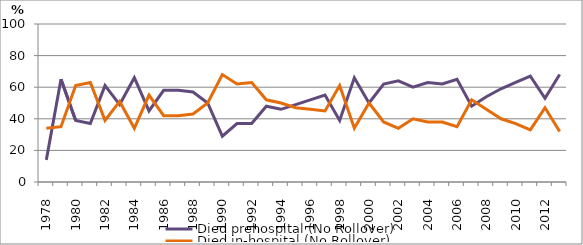
| Category | Died prehospital (No Rollover) | Died in-hospital (No Rollover) |
|---|---|---|
| 1978.0 | 14 | 34 |
| 1979.0 | 65 | 35 |
| 1980.0 | 39 | 61 |
| 1981.0 | 37 | 63 |
| 1982.0 | 61 | 39 |
| 1983.0 | 49 | 51 |
| 1984.0 | 66 | 34 |
| 1985.0 | 45 | 55 |
| 1986.0 | 58 | 42 |
| 1987.0 | 58 | 42 |
| 1988.0 | 57 | 43 |
| 1989.0 | 50 | 50 |
| 1990.0 | 29 | 68 |
| 1991.0 | 37 | 62 |
| 1992.0 | 37 | 63 |
| 1993.0 | 48 | 52 |
| 1994.0 | 46 | 50 |
| 1995.0 | 49 | 47 |
| 1996.0 | 52 | 46 |
| 1997.0 | 55 | 45 |
| 1998.0 | 39 | 61 |
| 1999.0 | 66 | 34 |
| 2000.0 | 50 | 50 |
| 2001.0 | 62 | 38 |
| 2002.0 | 64 | 34 |
| 2003.0 | 60 | 40 |
| 2004.0 | 63 | 38 |
| 2005.0 | 62 | 38 |
| 2006.0 | 65 | 35 |
| 2007.0 | 48 | 52 |
| 2008.0 | 54 | 46 |
| 2009.0 | 59 | 40 |
| 2010.0 | 63 | 37 |
| 2011.0 | 67 | 33 |
| 2012.0 | 53 | 47 |
| 2013.0 | 68 | 32 |